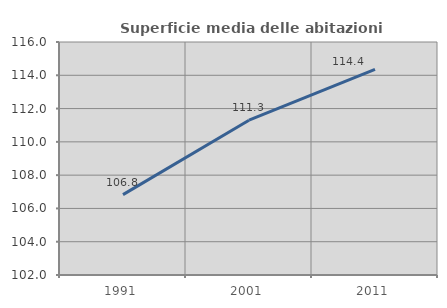
| Category | Superficie media delle abitazioni occupate |
|---|---|
| 1991.0 | 106.829 |
| 2001.0 | 111.302 |
| 2011.0 | 114.359 |